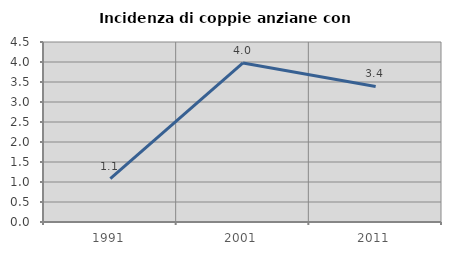
| Category | Incidenza di coppie anziane con figli |
|---|---|
| 1991.0 | 1.087 |
| 2001.0 | 3.977 |
| 2011.0 | 3.39 |